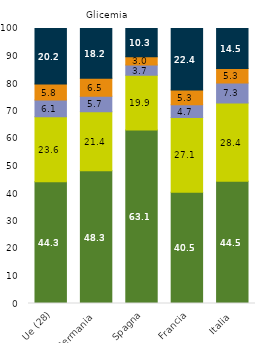
| Category | Meno di un anno | Da 1 a 3 anni | Da 3 a 5 anni | 5 anni e più | Mai |
|---|---|---|---|---|---|
| Ue (28) | 44.3 | 23.6 | 6.1 | 5.8 | 20.2 |
| Germania | 48.3 | 21.4 | 5.7 | 6.5 | 18.2 |
| Spagna | 63.1 | 19.9 | 3.7 | 3 | 10.3 |
| Francia | 40.5 | 27.1 | 4.7 | 5.3 | 22.4 |
| Italia | 44.5 | 28.4 | 7.3 | 5.3 | 14.5 |